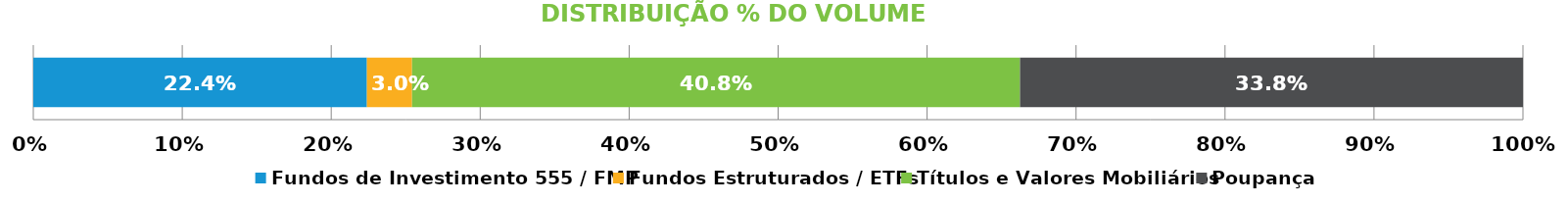
| Category | Fundos de Investimento 555 / FMP | Fundos Estruturados / ETFs | Títulos e Valores Mobiliários | Poupança |
|---|---|---|---|---|
| 0 | 0.224 | 0.03 | 0.408 | 0.338 |